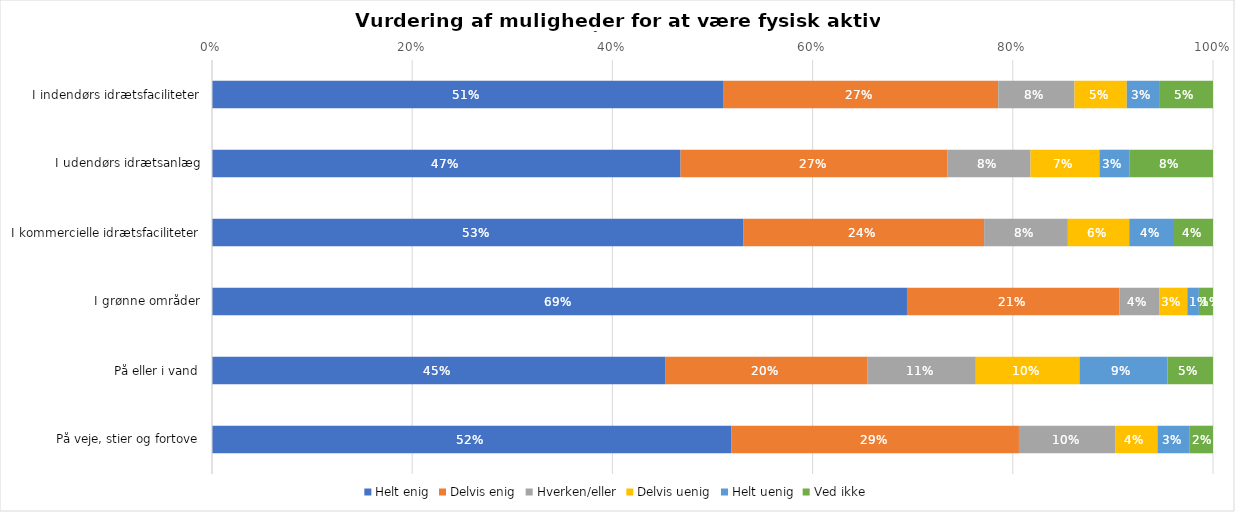
| Category | Helt enig | Delvis enig | Hverken/eller | Delvis uenig | Helt uenig | Ved ikke |
|---|---|---|---|---|---|---|
| I indendørs idrætsfaciliteter | 0.511 | 0.274 | 0.076 | 0.052 | 0.032 | 0.054 |
| I udendørs idrætsanlæg | 0.468 | 0.267 | 0.083 | 0.069 | 0.03 | 0.084 |
| I kommercielle idrætsfaciliteter | 0.531 | 0.24 | 0.084 | 0.061 | 0.045 | 0.039 |
| I grønne områder | 0.694 | 0.212 | 0.04 | 0.028 | 0.012 | 0.014 |
| På eller i vand | 0.453 | 0.201 | 0.109 | 0.104 | 0.088 | 0.046 |
| På veje, stier og fortove | 0.519 | 0.287 | 0.096 | 0.042 | 0.032 | 0.023 |